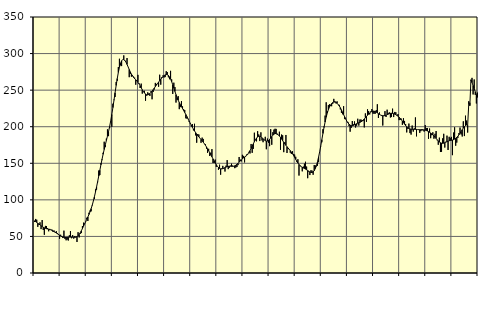
| Category | Piggar | Series 1 |
|---|---|---|
| nan | 69.7 | 71.33 |
| 87.0 | 73.9 | 70.25 |
| 87.0 | 72.8 | 69.25 |
| 87.0 | 63.1 | 68.08 |
| 87.0 | 66 | 66.91 |
| 87.0 | 69.3 | 65.73 |
| 87.0 | 60 | 64.57 |
| 87.0 | 72.4 | 63.51 |
| 87.0 | 58.8 | 62.55 |
| 87.0 | 52.2 | 61.75 |
| 87.0 | 64.4 | 61.09 |
| 87.0 | 64.1 | 60.57 |
| nan | 61.4 | 60.17 |
| 88.0 | 57 | 59.8 |
| 88.0 | 60.3 | 59.41 |
| 88.0 | 59.1 | 58.96 |
| 88.0 | 59.3 | 58.36 |
| 88.0 | 56.1 | 57.59 |
| 88.0 | 58 | 56.68 |
| 88.0 | 55 | 55.69 |
| 88.0 | 57.1 | 54.68 |
| 88.0 | 54.7 | 53.7 |
| 88.0 | 52.1 | 52.72 |
| 88.0 | 46.8 | 51.7 |
| nan | 52.3 | 50.72 |
| 89.0 | 49.2 | 49.88 |
| 89.0 | 47.8 | 49.23 |
| 89.0 | 57.9 | 48.79 |
| 89.0 | 46.5 | 48.6 |
| 89.0 | 44.7 | 48.59 |
| 89.0 | 45.7 | 48.72 |
| 89.0 | 44.4 | 48.89 |
| 89.0 | 51.6 | 49.04 |
| 89.0 | 57.4 | 49.1 |
| 89.0 | 47.5 | 49.04 |
| 89.0 | 51.8 | 48.92 |
| nan | 47 | 48.81 |
| 90.0 | 50.5 | 48.82 |
| 90.0 | 48.7 | 49.11 |
| 90.0 | 42.4 | 49.78 |
| 90.0 | 55.8 | 50.93 |
| 90.0 | 48.6 | 52.67 |
| 90.0 | 53.5 | 54.98 |
| 90.0 | 54.6 | 57.73 |
| 90.0 | 64.2 | 60.79 |
| 90.0 | 68.8 | 63.94 |
| 90.0 | 67.7 | 67.1 |
| 90.0 | 70.8 | 70.27 |
| nan | 75.6 | 73.39 |
| 91.0 | 71.1 | 76.6 |
| 91.0 | 82.4 | 79.99 |
| 91.0 | 85.5 | 83.74 |
| 91.0 | 84.3 | 87.96 |
| 91.0 | 92.2 | 92.72 |
| 91.0 | 98.3 | 98.13 |
| 91.0 | 101.1 | 104.17 |
| 91.0 | 114.3 | 110.72 |
| 91.0 | 113.9 | 117.72 |
| 91.0 | 124 | 125.07 |
| 91.0 | 140.1 | 132.65 |
| nan | 133.9 | 140.36 |
| 92.0 | 150.2 | 147.99 |
| 92.0 | 154.3 | 155.35 |
| 92.0 | 164.4 | 162.32 |
| 92.0 | 179.5 | 168.86 |
| 92.0 | 172.1 | 175.09 |
| 92.0 | 183.7 | 181.12 |
| 92.0 | 196.4 | 187.12 |
| 92.0 | 187.1 | 193.42 |
| 92.0 | 198.1 | 200.34 |
| 92.0 | 208.2 | 208.11 |
| 92.0 | 199.9 | 216.74 |
| nan | 231.5 | 226.16 |
| 93.0 | 237.1 | 236.19 |
| 93.0 | 240.6 | 246.42 |
| 93.0 | 261.2 | 256.44 |
| 93.0 | 262.8 | 265.85 |
| 93.0 | 281.6 | 274.24 |
| 93.0 | 292.9 | 281.26 |
| 93.0 | 284 | 286.56 |
| 93.0 | 282.9 | 290.04 |
| 93.0 | 291.6 | 291.73 |
| 93.0 | 297.5 | 291.83 |
| 93.0 | 291.2 | 290.6 |
| nan | 288.2 | 288.29 |
| 94.0 | 293.9 | 285.19 |
| 94.0 | 281.7 | 281.73 |
| 94.0 | 267.7 | 278.22 |
| 94.0 | 272.2 | 274.9 |
| 94.0 | 268.4 | 271.96 |
| 94.0 | 270.3 | 269.41 |
| 94.0 | 268.5 | 267.32 |
| 94.0 | 267.1 | 265.64 |
| 94.0 | 257.4 | 264.14 |
| 94.0 | 263.5 | 262.55 |
| 94.0 | 270.9 | 260.69 |
| nan | 259.5 | 258.51 |
| 95.0 | 252.9 | 255.98 |
| 95.0 | 258.9 | 253.26 |
| 95.0 | 245.2 | 250.6 |
| 95.0 | 248.7 | 248.17 |
| 95.0 | 249.1 | 246.12 |
| 95.0 | 235.5 | 244.6 |
| 95.0 | 242.5 | 243.74 |
| 95.0 | 247 | 243.57 |
| 95.0 | 245.5 | 244.1 |
| 95.0 | 242.1 | 245.23 |
| 95.0 | 248.6 | 246.77 |
| nan | 237.5 | 248.59 |
| 96.0 | 247.5 | 250.62 |
| 96.0 | 250.8 | 252.73 |
| 96.0 | 259.9 | 254.82 |
| 96.0 | 258.5 | 256.9 |
| 96.0 | 259.3 | 258.96 |
| 96.0 | 254.6 | 260.98 |
| 96.0 | 271.1 | 262.96 |
| 96.0 | 257.5 | 264.9 |
| 96.0 | 267.9 | 266.73 |
| 96.0 | 270.1 | 268.38 |
| 96.0 | 267.3 | 269.78 |
| nan | 267.8 | 270.82 |
| 97.0 | 275.9 | 271.3 |
| 97.0 | 274.7 | 271.1 |
| 97.0 | 267.5 | 270.08 |
| 97.0 | 264.9 | 268.13 |
| 97.0 | 276.4 | 265.27 |
| 97.0 | 264.8 | 261.61 |
| 97.0 | 244.8 | 257.37 |
| 97.0 | 260.2 | 252.81 |
| 97.0 | 254.2 | 248.25 |
| 97.0 | 233 | 243.87 |
| 97.0 | 236.8 | 239.84 |
| nan | 241.8 | 236.25 |
| 98.0 | 224 | 233.07 |
| 98.0 | 226.8 | 230.18 |
| 98.0 | 235 | 227.49 |
| 98.0 | 227.9 | 224.87 |
| 98.0 | 223.9 | 222.2 |
| 98.0 | 222.8 | 219.47 |
| 98.0 | 211.5 | 216.7 |
| 98.0 | 211.1 | 213.86 |
| 98.0 | 210.5 | 210.89 |
| 98.0 | 206.9 | 207.91 |
| 98.0 | 204.4 | 205 |
| nan | 200.7 | 202.14 |
| 99.0 | 203.7 | 199.37 |
| 99.0 | 195 | 196.76 |
| 99.0 | 204 | 194.29 |
| 99.0 | 188.1 | 191.98 |
| 99.0 | 178.1 | 189.84 |
| 99.0 | 190 | 187.9 |
| 99.0 | 189.3 | 186.09 |
| 99.0 | 184.2 | 184.33 |
| 99.0 | 178 | 182.57 |
| 99.0 | 185.1 | 180.78 |
| 99.0 | 183.3 | 178.9 |
| nan | 177.1 | 176.88 |
| 0.0 | 176 | 174.69 |
| 0.0 | 170 | 172.31 |
| 0.0 | 164.3 | 169.75 |
| 0.0 | 169.8 | 167.08 |
| 0.0 | 160 | 164.38 |
| 0.0 | 164.5 | 161.65 |
| 0.0 | 169.4 | 158.83 |
| 0.0 | 150.4 | 156.02 |
| 0.0 | 150.3 | 153.26 |
| 0.0 | 155.1 | 150.6 |
| 0.0 | 145.1 | 148.1 |
| nan | 145.8 | 145.93 |
| 1.0 | 141.1 | 144.22 |
| 1.0 | 148.1 | 143.05 |
| 1.0 | 134.4 | 142.44 |
| 1.0 | 143 | 142.36 |
| 1.0 | 146.5 | 142.69 |
| 1.0 | 142.9 | 143.32 |
| 1.0 | 138.7 | 144.08 |
| 1.0 | 146.8 | 144.83 |
| 1.0 | 154.3 | 145.46 |
| 1.0 | 142 | 145.85 |
| 1.0 | 144 | 145.99 |
| nan | 146.8 | 145.95 |
| 2.0 | 149.5 | 145.83 |
| 2.0 | 146.9 | 145.8 |
| 2.0 | 145.7 | 146.02 |
| 2.0 | 143.3 | 146.56 |
| 2.0 | 144.3 | 147.42 |
| 2.0 | 145 | 148.58 |
| 2.0 | 147.5 | 150 |
| 2.0 | 158.6 | 151.55 |
| 2.0 | 155.1 | 153.11 |
| 2.0 | 152.6 | 154.66 |
| 2.0 | 161.6 | 156.1 |
| nan | 160.1 | 157.38 |
| 3.0 | 151.2 | 158.57 |
| 3.0 | 159.1 | 159.73 |
| 3.0 | 162 | 161.03 |
| 3.0 | 162.3 | 162.67 |
| 3.0 | 165.7 | 164.74 |
| 3.0 | 163.4 | 167.25 |
| 3.0 | 176.4 | 170.15 |
| 3.0 | 164.3 | 173.3 |
| 3.0 | 169.7 | 176.47 |
| 3.0 | 191.8 | 179.54 |
| 3.0 | 181.6 | 182.28 |
| nan | 180 | 184.48 |
| 4.0 | 193.9 | 186.06 |
| 4.0 | 189.4 | 186.87 |
| 4.0 | 180.4 | 186.92 |
| 4.0 | 192.3 | 186.26 |
| 4.0 | 181.2 | 185.06 |
| 4.0 | 178.8 | 183.57 |
| 4.0 | 182.1 | 182.09 |
| 4.0 | 186.2 | 180.92 |
| 4.0 | 169.2 | 180.34 |
| 4.0 | 183.8 | 180.41 |
| 4.0 | 178 | 181.21 |
| nan | 173.4 | 182.66 |
| 5.0 | 196.6 | 184.51 |
| 5.0 | 175.3 | 186.51 |
| 5.0 | 192.5 | 188.4 |
| 5.0 | 196 | 189.85 |
| 5.0 | 197.2 | 190.65 |
| 5.0 | 197 | 190.75 |
| 5.0 | 188.9 | 190.17 |
| 5.0 | 188.8 | 188.96 |
| 5.0 | 193.2 | 187.3 |
| 5.0 | 168.5 | 185.32 |
| 5.0 | 189.3 | 183.14 |
| nan | 188.3 | 180.9 |
| 6.0 | 165.2 | 178.67 |
| 6.0 | 178.8 | 176.52 |
| 6.0 | 188.7 | 174.52 |
| 6.0 | 164.1 | 172.65 |
| 6.0 | 170.1 | 170.89 |
| 6.0 | 168.7 | 169.15 |
| 6.0 | 164.4 | 167.34 |
| 6.0 | 162.7 | 165.38 |
| 6.0 | 166.5 | 163.18 |
| 6.0 | 162.8 | 160.71 |
| 6.0 | 161.9 | 158.05 |
| nan | 158.9 | 155.32 |
| 7.0 | 151.7 | 152.72 |
| 7.0 | 155.5 | 150.42 |
| 7.0 | 133.2 | 148.41 |
| 7.0 | 146.2 | 146.72 |
| 7.0 | 145.7 | 145.43 |
| 7.0 | 139 | 144.43 |
| 7.0 | 145.5 | 143.61 |
| 7.0 | 149.5 | 142.85 |
| 7.0 | 152.1 | 142.05 |
| 7.0 | 145.5 | 141.14 |
| 7.0 | 129.6 | 140.13 |
| nan | 138.4 | 139.06 |
| 8.0 | 133.9 | 138.11 |
| 8.0 | 140.5 | 137.48 |
| 8.0 | 140 | 137.42 |
| 8.0 | 134.3 | 138.17 |
| 8.0 | 147.6 | 139.91 |
| 8.0 | 147.1 | 142.79 |
| 8.0 | 145.8 | 146.88 |
| 8.0 | 146.6 | 152.13 |
| 8.0 | 151.5 | 158.45 |
| 8.0 | 165.6 | 165.71 |
| 8.0 | 173.2 | 173.76 |
| nan | 178.7 | 182.25 |
| 9.0 | 196.6 | 190.77 |
| 9.0 | 200.3 | 198.95 |
| 9.0 | 215.2 | 206.45 |
| 9.0 | 233.4 | 213.08 |
| 9.0 | 221.3 | 218.69 |
| 9.0 | 229.5 | 223.26 |
| 9.0 | 230.7 | 226.88 |
| 9.0 | 228.7 | 229.67 |
| 9.0 | 228 | 231.69 |
| 9.0 | 231.2 | 233 |
| 9.0 | 238.1 | 233.66 |
| nan | 234.9 | 233.71 |
| 10.0 | 231.9 | 233.17 |
| 10.0 | 234.7 | 232.06 |
| 10.0 | 230.1 | 230.45 |
| 10.0 | 229.9 | 228.39 |
| 10.0 | 223.6 | 225.92 |
| 10.0 | 218.9 | 223.06 |
| 10.0 | 217 | 219.89 |
| 10.0 | 228.1 | 216.6 |
| 10.0 | 210.4 | 213.36 |
| 10.0 | 211 | 210.31 |
| 10.0 | 207.2 | 207.57 |
| nan | 206.5 | 205.24 |
| 11.0 | 200.9 | 203.41 |
| 11.0 | 193.2 | 202.15 |
| 11.0 | 198.4 | 201.47 |
| 11.0 | 207.8 | 201.38 |
| 11.0 | 203.3 | 201.76 |
| 11.0 | 207.2 | 202.5 |
| 11.0 | 198.9 | 203.36 |
| 11.0 | 201.4 | 204.15 |
| 11.0 | 210.9 | 204.82 |
| 11.0 | 201.5 | 205.42 |
| 11.0 | 209.8 | 206.01 |
| nan | 209.8 | 206.72 |
| 12.0 | 209 | 207.68 |
| 12.0 | 207.9 | 208.98 |
| 12.0 | 199 | 210.56 |
| 12.0 | 218.2 | 212.26 |
| 12.0 | 206.7 | 213.99 |
| 12.0 | 223.8 | 215.7 |
| 12.0 | 221.3 | 217.31 |
| 12.0 | 216.8 | 218.76 |
| 12.0 | 220.9 | 219.99 |
| 12.0 | 224.2 | 220.88 |
| 12.0 | 217.9 | 221.33 |
| nan | 217.8 | 221.29 |
| 13.0 | 217.7 | 220.79 |
| 13.0 | 222.7 | 219.93 |
| 13.0 | 230.7 | 218.87 |
| 13.0 | 211.9 | 217.79 |
| 13.0 | 219.5 | 216.79 |
| 13.0 | 216 | 215.97 |
| 13.0 | 214.6 | 215.36 |
| 13.0 | 201.6 | 215.03 |
| 13.0 | 214.5 | 215.01 |
| 13.0 | 221.3 | 215.26 |
| 13.0 | 213.3 | 215.73 |
| nan | 223.3 | 216.4 |
| 14.0 | 218.5 | 217.14 |
| 14.0 | 219.7 | 217.8 |
| 14.0 | 212.6 | 218.25 |
| 14.0 | 213.2 | 218.4 |
| 14.0 | 224.7 | 218.25 |
| 14.0 | 213.2 | 217.81 |
| 14.0 | 220.2 | 217.18 |
| 14.0 | 219.7 | 216.43 |
| 14.0 | 215 | 215.51 |
| 14.0 | 217.3 | 214.37 |
| 14.0 | 209 | 213.01 |
| nan | 209.4 | 211.42 |
| 15.0 | 211 | 209.61 |
| 15.0 | 202.6 | 207.65 |
| 15.0 | 211.6 | 205.57 |
| 15.0 | 207.9 | 203.53 |
| 15.0 | 203.7 | 201.64 |
| 15.0 | 192.2 | 199.96 |
| 15.0 | 197.1 | 198.62 |
| 15.0 | 204.3 | 197.61 |
| 15.0 | 191.3 | 196.94 |
| 15.0 | 189.2 | 196.57 |
| 15.0 | 201.6 | 196.43 |
| nan | 193.3 | 196.43 |
| 16.0 | 197.8 | 196.45 |
| 16.0 | 212.7 | 196.39 |
| 16.0 | 186.8 | 196.29 |
| 16.0 | 196.1 | 196.12 |
| 16.0 | 196.3 | 195.96 |
| 16.0 | 191.6 | 195.87 |
| 16.0 | 193.9 | 195.84 |
| 16.0 | 196.8 | 195.82 |
| 16.0 | 195 | 195.76 |
| 16.0 | 193.3 | 195.61 |
| 16.0 | 202.2 | 195.3 |
| nan | 198.1 | 194.82 |
| 17.0 | 198.2 | 194.14 |
| 17.0 | 183.5 | 193.31 |
| 17.0 | 197.5 | 192.39 |
| 17.0 | 184.3 | 191.42 |
| 17.0 | 188.4 | 190.23 |
| 17.0 | 192.4 | 188.85 |
| 17.0 | 183.6 | 187.32 |
| 17.0 | 190.3 | 185.62 |
| 17.0 | 194.1 | 183.88 |
| 17.0 | 181.4 | 182.17 |
| 17.0 | 175.3 | 180.56 |
| nan | 185.1 | 179.1 |
| 18.0 | 165.4 | 178.06 |
| 18.0 | 165.7 | 177.48 |
| 18.0 | 184.1 | 177.31 |
| 18.0 | 190.3 | 177.51 |
| 18.0 | 171.5 | 178.08 |
| 18.0 | 179.5 | 178.87 |
| 18.0 | 187.8 | 179.69 |
| 18.0 | 168.2 | 180.36 |
| 18.0 | 186.2 | 180.81 |
| 18.0 | 184.4 | 181.12 |
| 18.0 | 186.1 | 181.38 |
| nan | 161.1 | 181.77 |
| 19.0 | 192 | 182.3 |
| 19.0 | 199.2 | 183.07 |
| 19.0 | 174 | 184.11 |
| 19.0 | 178.3 | 185.4 |
| 19.0 | 184.7 | 186.98 |
| 19.0 | 191.4 | 188.91 |
| 19.0 | 198.8 | 191.08 |
| 19.0 | 189.4 | 193.48 |
| 19.0 | 186.6 | 195.93 |
| 19.0 | 207.4 | 198.2 |
| 19.0 | 187.2 | 200.18 |
| nan | 215.1 | 201.64 |
| 20.0 | 208.4 | 202.37 |
| 20.0 | 192 | 202.12 |
| 20.0 | 234.8 | 231.01 |
| 20.0 | 232.8 | 228.88 |
| 20.0 | 263.8 | 264.08 |
| 20.0 | 266.8 | 260.42 |
| 20.0 | 244.1 | 256.28 |
| 20.0 | 264.6 | 251.94 |
| 20.0 | 243.5 | 247.7 |
| 20.0 | 231.8 | 243.72 |
| 20.0 | 246.6 | 240.09 |